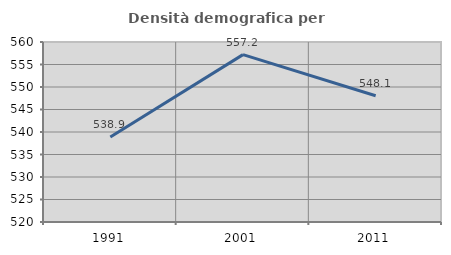
| Category | Densità demografica |
|---|---|
| 1991.0 | 538.906 |
| 2001.0 | 557.196 |
| 2011.0 | 548.051 |